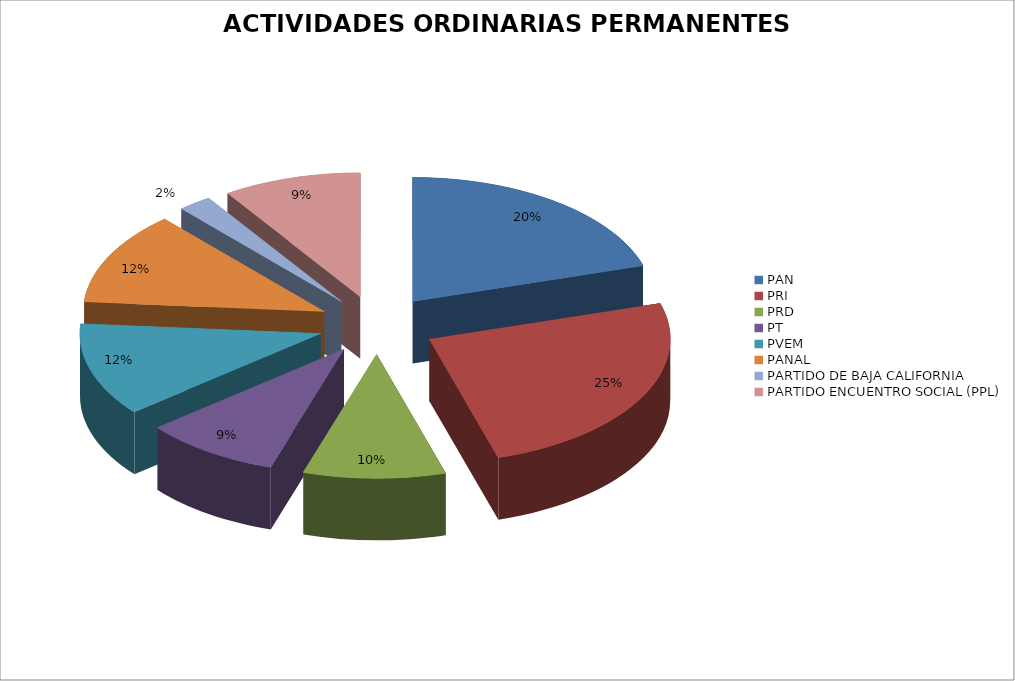
| Category | Series 0 |
|---|---|
| PAN | 2594961.56 |
| PRI | 3199091.69 |
| PRD | 1217893.63 |
| PT | 1170273.63 |
| PVEM | 1555525.83 |
| PANAL | 1555525.83 |
| PARTIDO DE BAJA CALIFORNIA | 288939.15 |
| PARTIDO ENCUENTRO SOCIAL (PPL) | 1185524.63 |